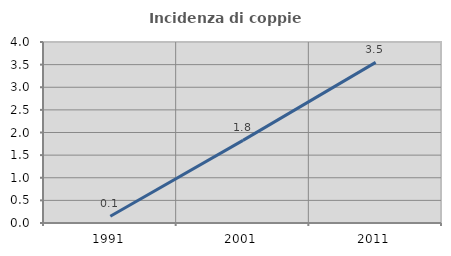
| Category | Incidenza di coppie miste |
|---|---|
| 1991.0 | 0.148 |
| 2001.0 | 1.826 |
| 2011.0 | 3.549 |